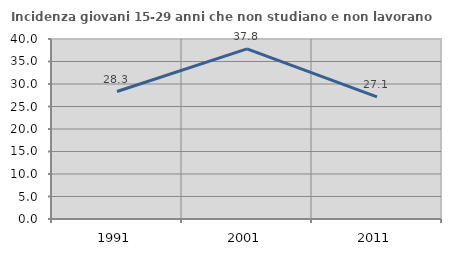
| Category | Incidenza giovani 15-29 anni che non studiano e non lavorano  |
|---|---|
| 1991.0 | 28.333 |
| 2001.0 | 37.808 |
| 2011.0 | 27.138 |